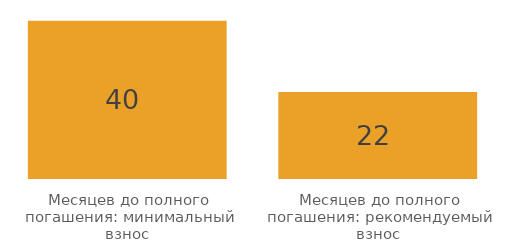
| Category | Series 0 |
|---|---|
| Месяцев до полного погашения: минимальный взнос | 40 |
| Месяцев до полного погашения: рекомендуемый взнос | 22 |